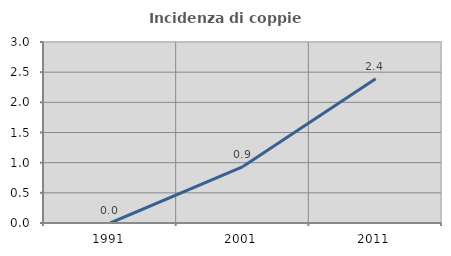
| Category | Incidenza di coppie miste |
|---|---|
| 1991.0 | 0 |
| 2001.0 | 0.936 |
| 2011.0 | 2.392 |